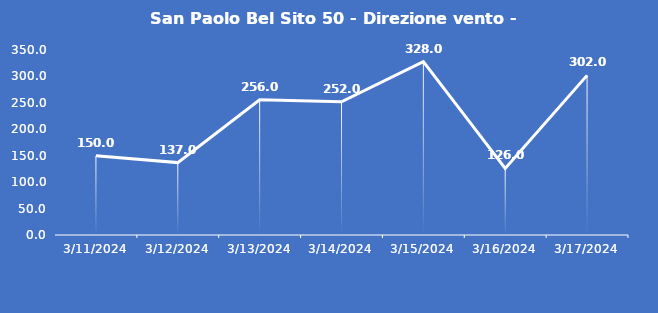
| Category | San Paolo Bel Sito 50 - Direzione vento - Grezzo (°N) |
|---|---|
| 3/11/24 | 150 |
| 3/12/24 | 137 |
| 3/13/24 | 256 |
| 3/14/24 | 252 |
| 3/15/24 | 328 |
| 3/16/24 | 126 |
| 3/17/24 | 302 |